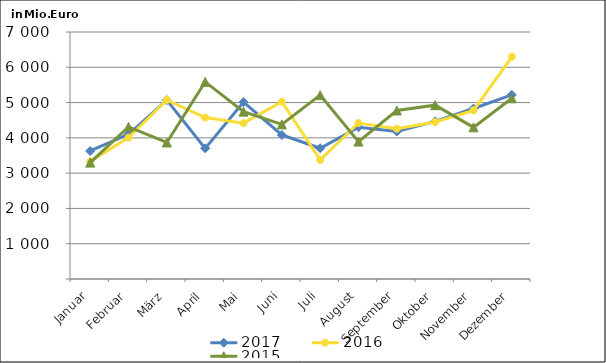
| Category | 2017 | 2016 | 2015 |
|---|---|---|---|
| Januar | 3627.974 | 3333.01 | 3298.517 |
| Februar | 4101.883 | 4006.401 | 4309.693 |
| März | 5069.377 | 5074.784 | 3869.705 |
| April | 3703.043 | 4573.963 | 5587.68 |
| Mai | 5012.558 | 4417.476 | 4743.116 |
| Juni | 4082.359 | 5025.358 | 4381.85 |
| Juli | 3705.143 | 3374.087 | 5210.899 |
| August | 4301.77 | 4420.733 | 3894.012 |
| September | 4179.418 | 4258.431 | 4775.056 |
| Oktober | 4467.558 | 4450.498 | 4926.294 |
| November | 4831.699 | 4778.864 | 4297.974 |
| Dezember | 5218.941 | 6296.718 | 5122.134 |